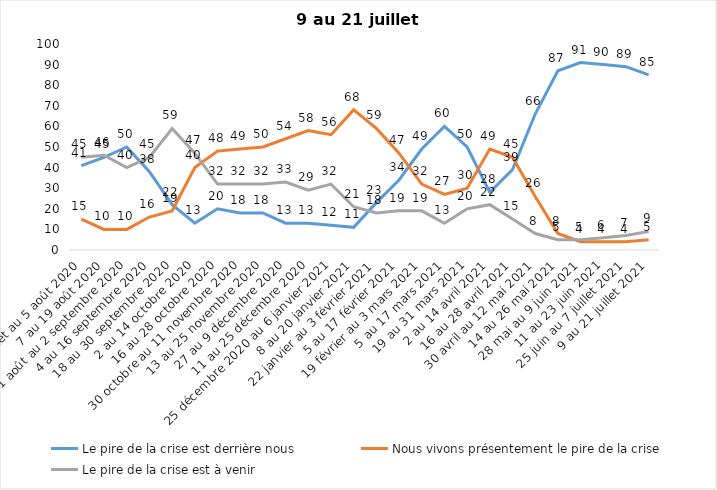
| Category | Le pire de la crise est derrière nous | Nous vivons présentement le pire de la crise | Le pire de la crise est à venir |
|---|---|---|---|
| 24 juillet au 5 août 2020 | 41 | 15 | 45 |
| 7 au 19 août 2020 | 45 | 10 | 46 |
| 21 août au 2 septembre 2020 | 50 | 10 | 40 |
| 4 au 16 septembre 2020 | 38 | 16 | 45 |
| 18 au 30 septembre 2020 | 22 | 19 | 59 |
| 2 au 14 octobre 2020 | 13 | 40 | 47 |
| 16 au 28 octobre 2020 | 20 | 48 | 32 |
| 30 octobre au 11 novembre 2020 | 18 | 49 | 32 |
| 13 au 25 novembre 2020 | 18 | 50 | 32 |
| 27 au 9 décembre 2020 | 13 | 54 | 33 |
| 11 au 25 décembre 2020 | 13 | 58 | 29 |
| 25 décembre 2020 au 6 janvier 2021 | 12 | 56 | 32 |
| 8 au 20 janvier 2021 | 11 | 68 | 21 |
| 22 janvier au 3 février 2021 | 23 | 59 | 18 |
| 5 au 17 février 2021 | 34 | 47 | 19 |
| 19 février au 3 mars 2021 | 49 | 32 | 19 |
| 5 au 17 mars 2021 | 60 | 27 | 13 |
| 19 au 31 mars 2021 | 50 | 30 | 20 |
| 2 au 14 avril 2021 | 28 | 49 | 22 |
| 16 au 28 avril 2021 | 39 | 45 | 15 |
| 30 avril au 12 mai 2021 | 66 | 26 | 8 |
| 14 au 26 mai 2021 | 87 | 8 | 5 |
| 28 mai au 9 juin 2021 | 91 | 4 | 5 |
| 11 au 23 juin 2021 | 90 | 4 | 6 |
| 25 juin au 7 juillet 2021 | 89 | 4 | 7 |
| 9 au 21 juillet 2021 | 85 | 5 | 9 |